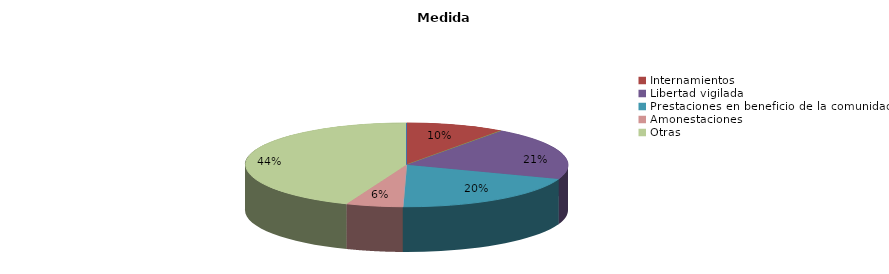
| Category | Series 0 |
|---|---|
| Expedientes de ejecución | 0 |
| Internamientos | 14 |
| Permanencias de fines de semana | 0 |
| Libertad vigilada | 29 |
| Prestaciones en beneficio de la comunidad | 28 |
| Privación de permisos y licencias | 0 |
| Convivencia Familiar Educativa | 0 |
| Amonestaciones | 8 |
| Otras | 62 |